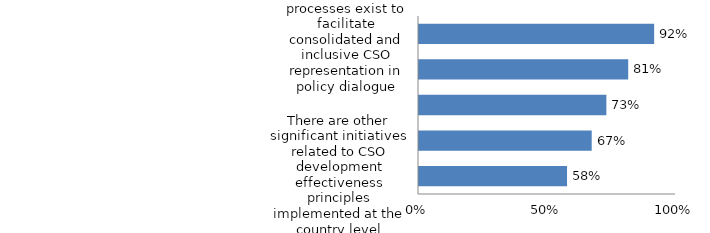
| Category | Series 0 |
|---|---|
| There are other significant initiatives related to CSO development effectiveness principles implemented at the country level | 0.576 |
| CSOs report annually to government on basic finances, sector support and main geographic areas of involvement in development | 0.672 |
| CSO-managed processes exist to address transparency and multiple accountabilities in CSO operations | 0.729 |
| Mechanisms exist to facilitate co-ordination on programming among CSOs and with other development actors | 0.814 |
| CSO-led co-ordination processes exist to facilitate consolidated and inclusive CSO representation in policy dialogue | 0.915 |